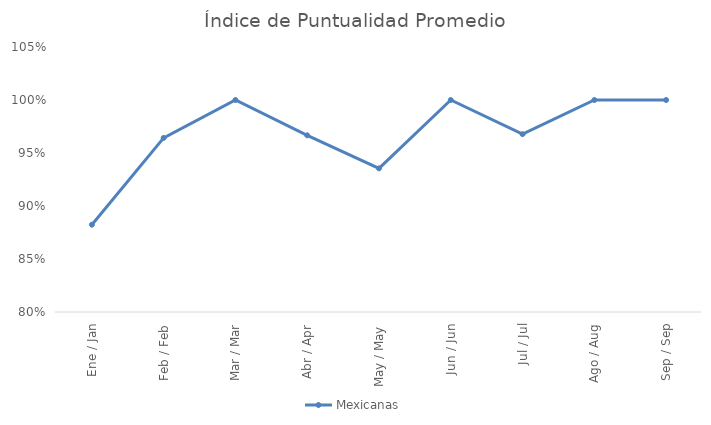
| Category | Mexicanas |
|---|---|
| Ene / Jan | 0.882 |
| Feb / Feb | 0.964 |
| Mar / Mar | 1 |
| Abr / Apr | 0.967 |
| May / May | 0.935 |
| Jun / Jun | 1 |
| Jul / Jul | 0.968 |
| Ago / Aug | 1 |
| Sep / Sep | 1 |